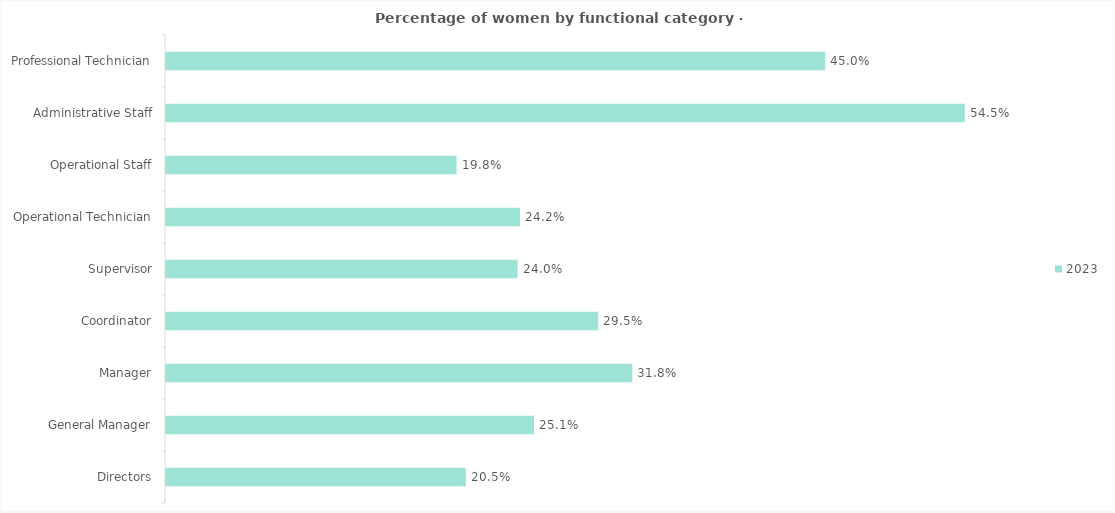
| Category | 2023 |
|---|---|
| Directors | 0.205 |
| General Manager | 0.251 |
| Manager | 0.318 |
| Coordinator | 0.295 |
| Supervisor | 0.24 |
| Operational Technician | 0.242 |
| Operational Staff | 0.198 |
| Administrative Staff | 0.545 |
| Professional Technician | 0.45 |